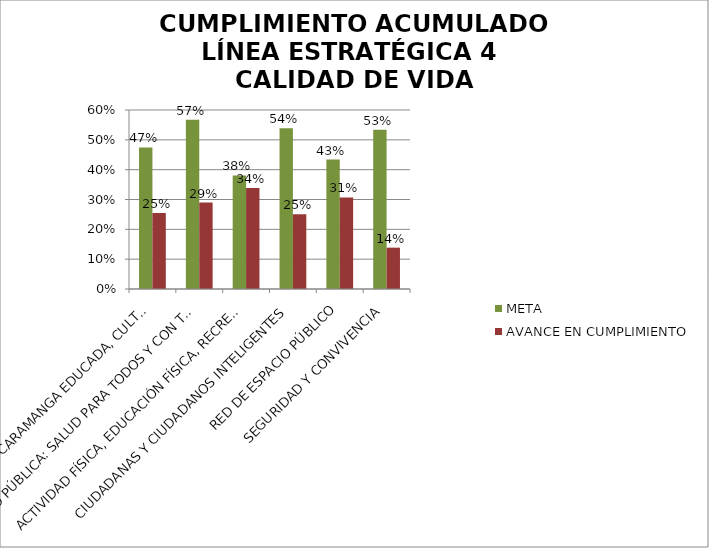
| Category | META | AVANCE EN CUMPLIMIENTO |
|---|---|---|
| EDUCACIÓN: BUCARAMANGA EDUCADA, CULTA E INNOVADORA | 0.475 | 0.255 |
| SALUD PÚBLICA: SALUD PARA TODOS Y CON TODOS | 0.567 | 0.29 |
| ACTIVIDAD FÍSICA, EDUCACIÓN FÍSICA, RECREACIÓN Y DEPORTE | 0.38 | 0.339 |
| CIUDADANAS Y CIUDADANOS INTELIGENTES | 0.539 | 0.25 |
| RED DE ESPACIO PÚBLICO | 0.434 | 0.307 |
| SEGURIDAD Y CONVIVENCIA | 0.534 | 0.139 |